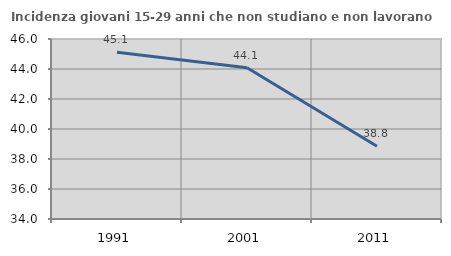
| Category | Incidenza giovani 15-29 anni che non studiano e non lavorano  |
|---|---|
| 1991.0 | 45.116 |
| 2001.0 | 44.089 |
| 2011.0 | 38.847 |